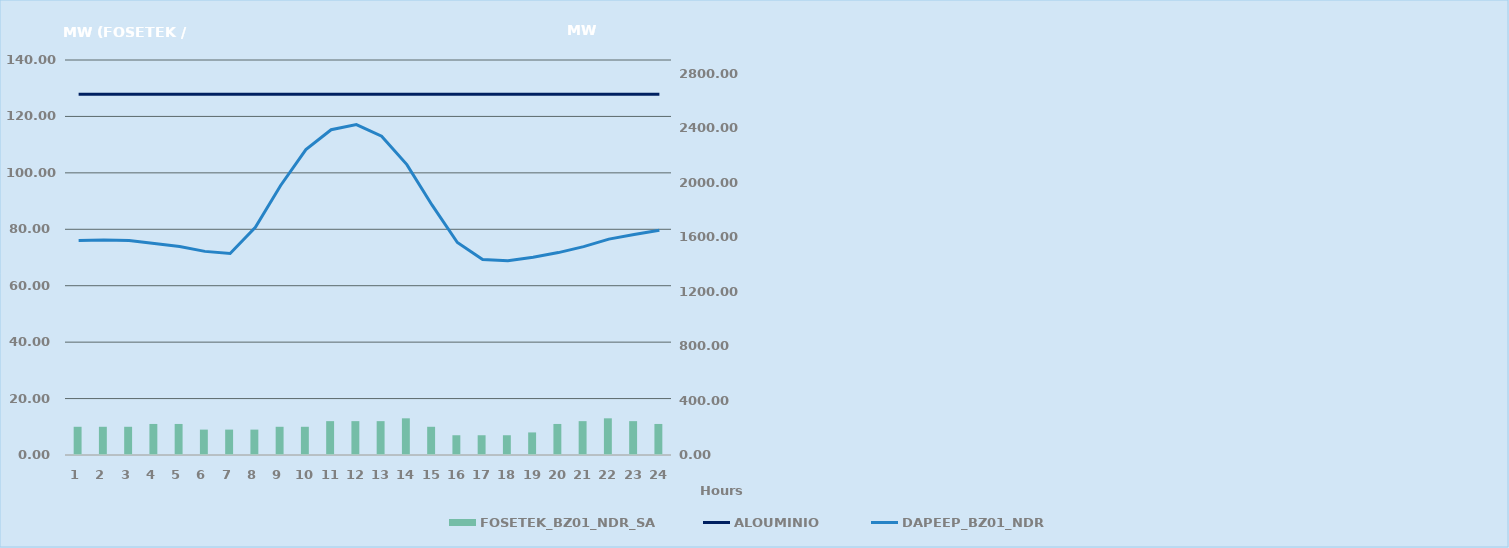
| Category | FOSETEK_BZ01_NDR_SA |
|---|---|
| 0 | 10 |
| 1 | 10 |
| 2 | 10 |
| 3 | 11 |
| 4 | 11 |
| 5 | 9 |
| 6 | 9 |
| 7 | 9 |
| 8 | 10 |
| 9 | 10 |
| 10 | 12 |
| 11 | 12 |
| 12 | 12 |
| 13 | 13 |
| 14 | 10 |
| 15 | 7 |
| 16 | 7 |
| 17 | 7 |
| 18 | 8 |
| 19 | 11 |
| 20 | 12 |
| 21 | 13 |
| 22 | 12 |
| 23 | 11 |